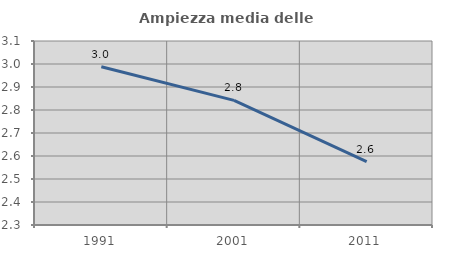
| Category | Ampiezza media delle famiglie |
|---|---|
| 1991.0 | 2.988 |
| 2001.0 | 2.842 |
| 2011.0 | 2.575 |